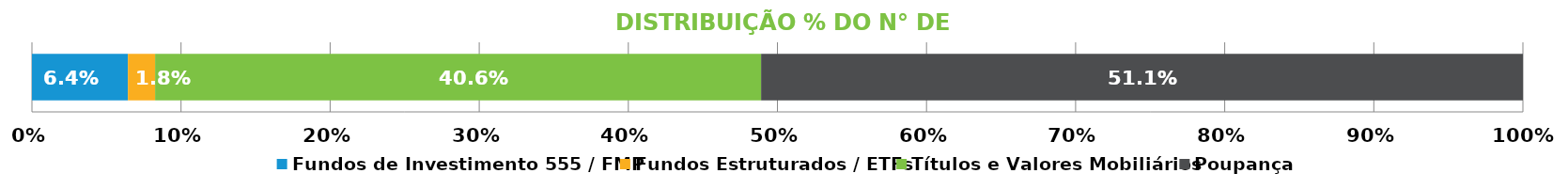
| Category | Fundos de Investimento 555 / FMP | Fundos Estruturados / ETFs | Títulos e Valores Mobiliários | Poupança |
|---|---|---|---|---|
| 0 | 0.064 | 0.018 | 0.406 | 0.511 |